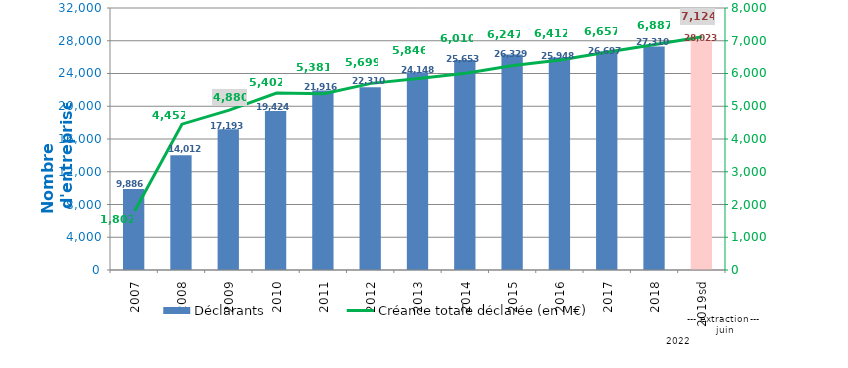
| Category | Déclarants |
|---|---|
| 2007 | 9886 |
| 2008 | 14012 |
| 2009 | 17193 |
| 2010 | 19424 |
| 2011 | 21916 |
| 2012 | 22310 |
| 2013 | 24148 |
| 2014 | 25653 |
| 2015 | 26329 |
| 2016 | 25948 |
| 2017 | 26697 |
| 2018 | 27310 |
| 2019sd | 28023 |